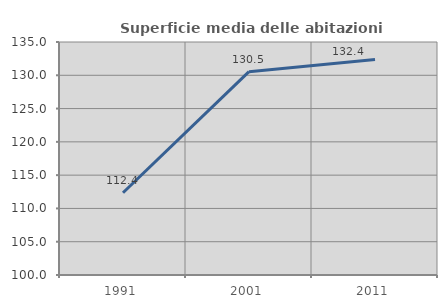
| Category | Superficie media delle abitazioni occupate |
|---|---|
| 1991.0 | 112.351 |
| 2001.0 | 130.545 |
| 2011.0 | 132.365 |